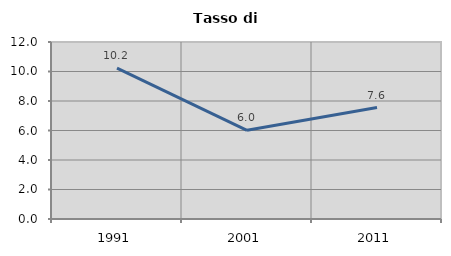
| Category | Tasso di disoccupazione   |
|---|---|
| 1991.0 | 10.23 |
| 2001.0 | 6.015 |
| 2011.0 | 7.555 |